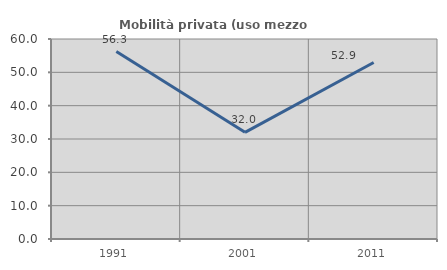
| Category | Mobilità privata (uso mezzo privato) |
|---|---|
| 1991.0 | 56.25 |
| 2001.0 | 32 |
| 2011.0 | 52.941 |